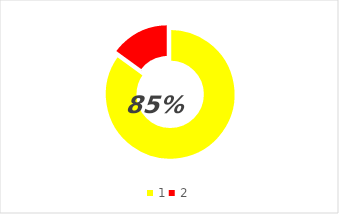
| Category | Series 0 |
|---|---|
| 0 | 0.85 |
| 1 | 0.15 |